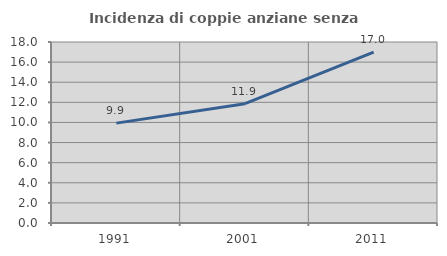
| Category | Incidenza di coppie anziane senza figli  |
|---|---|
| 1991.0 | 9.934 |
| 2001.0 | 11.864 |
| 2011.0 | 17.003 |